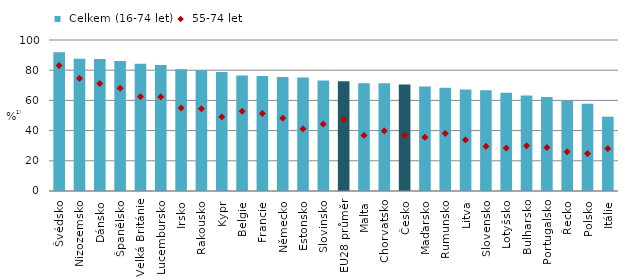
| Category |  Celkem (16-74 let) |
|---|---|
| Švédsko | 91.92 |
| Nizozemsko | 87.524 |
| Dánsko | 87.394 |
| Španělsko | 86.174 |
| Velká Británie | 84.317 |
| Lucembursko | 83.504 |
| Irsko | 80.687 |
| Rakousko | 79.946 |
| Kypr | 78.818 |
| Belgie | 76.527 |
| Francie | 76.112 |
| Německo | 75.49 |
| Estonsko | 75.197 |
| Slovinsko | 73.255 |
| EU28 průměr | 72.708 |
| Malta | 71.433 |
| Chorvatsko | 71.412 |
| Česko | 70.547 |
| Maďarsko | 69.251 |
| Rumunsko | 68.299 |
| Litva | 67.146 |
| Slovensko | 66.674 |
| Lotyšsko | 65.032 |
| Bulharsko | 63.231 |
| Portugalsko | 62.17 |
| Řecko | 59.698 |
| Polsko | 57.819 |
| Itálie | 49.235 |